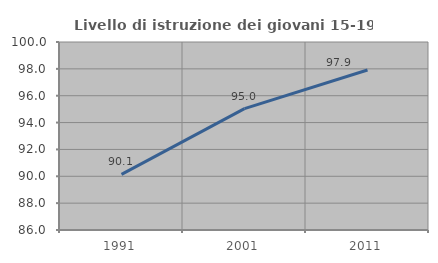
| Category | Livello di istruzione dei giovani 15-19 anni |
|---|---|
| 1991.0 | 90.141 |
| 2001.0 | 95.041 |
| 2011.0 | 97.917 |